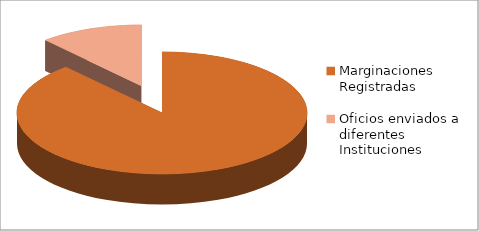
| Category | Series 0 |
|---|---|
| Marginaciones Registradas | 46 |
| Oficios enviados a diferentes Instituciones | 6 |